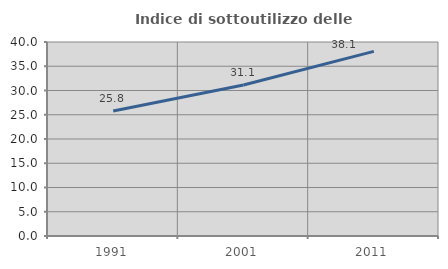
| Category | Indice di sottoutilizzo delle abitazioni  |
|---|---|
| 1991.0 | 25.756 |
| 2001.0 | 31.126 |
| 2011.0 | 38.07 |